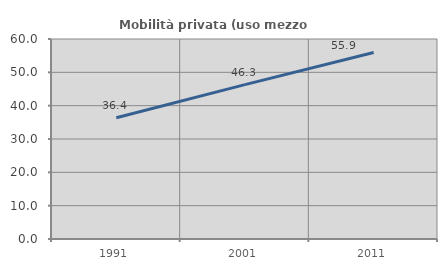
| Category | Mobilità privata (uso mezzo privato) |
|---|---|
| 1991.0 | 36.358 |
| 2001.0 | 46.304 |
| 2011.0 | 55.946 |